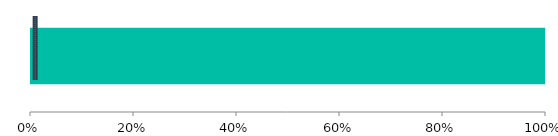
| Category | Good | Bad | Target |
|---|---|---|---|
| 0 | 9600 | 0 | 0 |